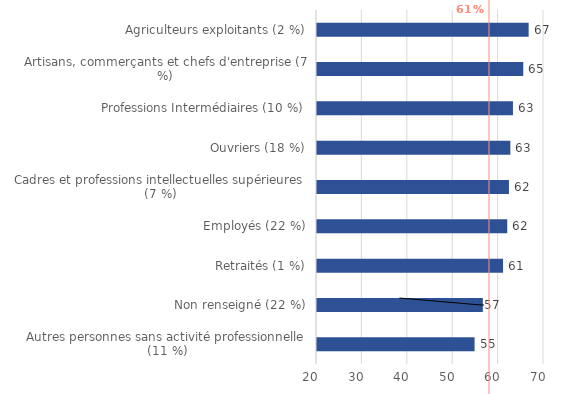
| Category | Series 0 |
|---|---|
| Autres personnes sans activité professionnelle (11 %) | 54.71 |
| Non renseigné (22 %) | 56.53 |
| Retraités (1 %) | 60.98 |
| Employés (22 %) | 61.9 |
| Cadres et professions intellectuelles supérieures (7 %) | 62.28 |
| Ouvriers (18 %) | 62.59 |
| Professions Intermédiaires (10 %) | 63.16 |
| Artisans, commerçants et chefs d'entreprise (7 %) | 65.43 |
| Agriculteurs exploitants (2 %) | 66.62 |